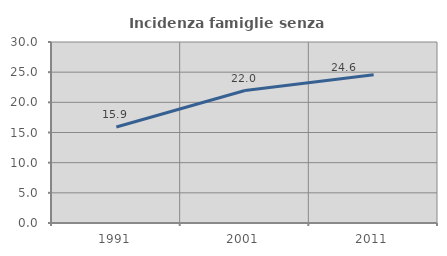
| Category | Incidenza famiglie senza nuclei |
|---|---|
| 1991.0 | 15.901 |
| 2001.0 | 21.953 |
| 2011.0 | 24.581 |